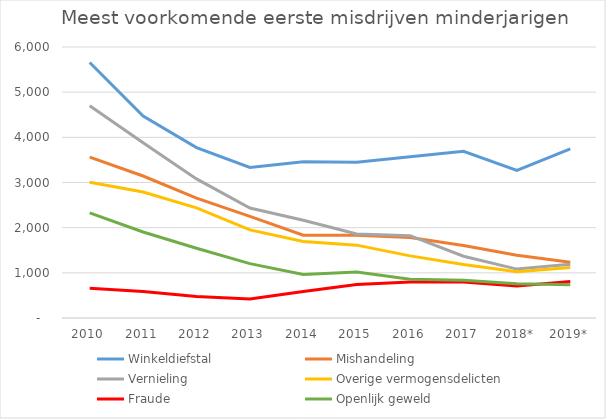
| Category | Winkeldiefstal | Mishandeling | Vernieling | Overige vermogensdelicten | Fraude | Openlijk geweld |
|---|---|---|---|---|---|---|
| 2010 | 5656 | 3563 | 4697 | 3004 | 657 | 2326 |
| 2011 | 4469 | 3144 | 3880 | 2788 | 588 | 1905 |
| 2012 | 3772 | 2652 | 3079 | 2440 | 476 | 1545 |
| 2013 | 3335 | 2251 | 2434 | 1951 | 423 | 1203 |
| 2014 | 3460 | 1833 | 2164 | 1694 | 585 | 963 |
| 2015 | 3451 | 1832 | 1859 | 1613 | 740 | 1019 |
| 2016 | 3571 | 1783 | 1823 | 1375 | 797 | 857 |
| 2017 | 3690 | 1605 | 1368 | 1186 | 798 | 837 |
| 2018* | 3267 | 1389 | 1083 | 1026 | 711 | 760 |
| 2019* | 3743 | 1234 | 1190 | 1120 | 807 | 735 |